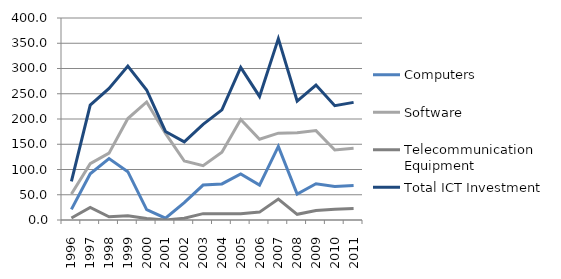
| Category | Computers | Software | Telecommunication Equipment | Total ICT Investment |
|---|---|---|---|---|
| 1996.0 | 21.002 | 51.381 | 3.996 | 76.379 |
| 1997.0 | 91.394 | 111.531 | 24.754 | 227.679 |
| 1998.0 | 121.592 | 132.434 | 6.446 | 260.472 |
| 1999.0 | 95.703 | 200.879 | 8.174 | 304.756 |
| 2000.0 | 20.7 | 233.759 | 2.957 | 257.416 |
| 2001.0 | 3.659 | 171.61 | 0.012 | 175.281 |
| 2002.0 | 34.252 | 116.842 | 3.669 | 154.763 |
| 2003.0 | 69.184 | 107.646 | 12.568 | 189.398 |
| 2004.0 | 71.411 | 134.025 | 12.608 | 218.044 |
| 2005.0 | 91.043 | 198.899 | 12.374 | 302.316 |
| 2006.0 | 69.179 | 159.908 | 15.606 | 244.693 |
| 2007.0 | 145.626 | 171.92 | 41.564 | 359.11 |
| 2008.0 | 51.389 | 172.884 | 11.267 | 235.54 |
| 2009.0 | 71.721 | 177.006 | 18.592 | 267.319 |
| 2010.0 | 66.395 | 138.554 | 21.329 | 226.278 |
| 2011.0 | 68.16 | 141.987 | 22.752 | 232.899 |